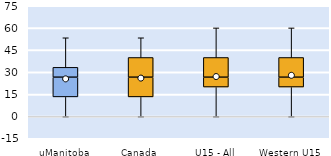
| Category | 25th | 50th | 75th |
|---|---|---|---|
| uManitoba | 13.333 | 13.333 | 6.667 |
| Canada | 13.333 | 13.333 | 13.333 |
| U15 - All | 20 | 6.667 | 13.333 |
| Western U15 | 20 | 6.667 | 13.333 |